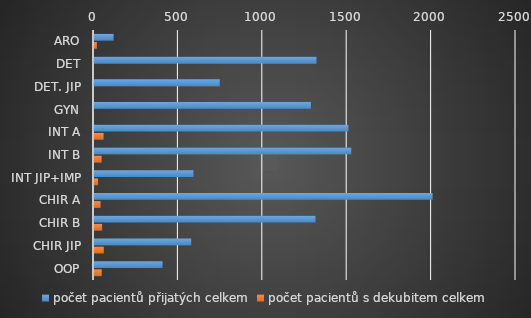
| Category | počet pacientů přijatých celkem | počet pacientů s dekubitem celkem |
|---|---|---|
| ARO | 116 | 17 |
| DET | 1318 | 0 |
| DET. JIP | 745 | 0 |
| GYN | 1285 | 0 |
| INT A | 1507 | 57 |
| INT B | 1524 | 45 |
| INT JIP+IMP | 589 | 24 |
| CHIR A | 2006 | 39 |
| CHIR B | 1312 | 48 |
| CHIR JIP | 576 | 58 |
| OOP | 406 | 46 |